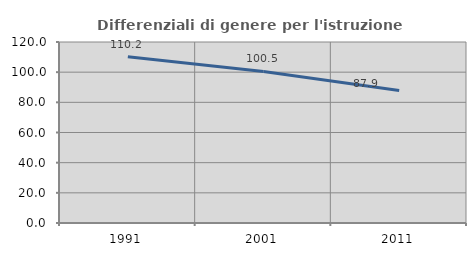
| Category | Differenziali di genere per l'istruzione superiore |
|---|---|
| 1991.0 | 110.211 |
| 2001.0 | 100.506 |
| 2011.0 | 87.878 |